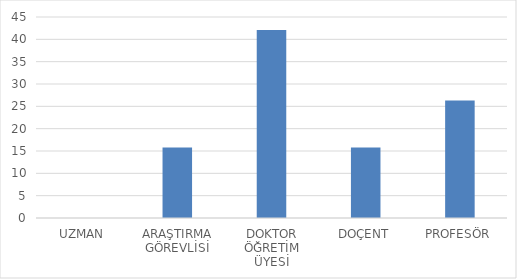
| Category | Series 0 |
|---|---|
| UZMAN | 0 |
| ARAŞTIRMA GÖREVLİSİ | 15.79 |
| DOKTOR ÖĞRETİM ÜYESİ | 42.11 |
| DOÇENT | 15.79 |
| PROFESÖR | 26.32 |